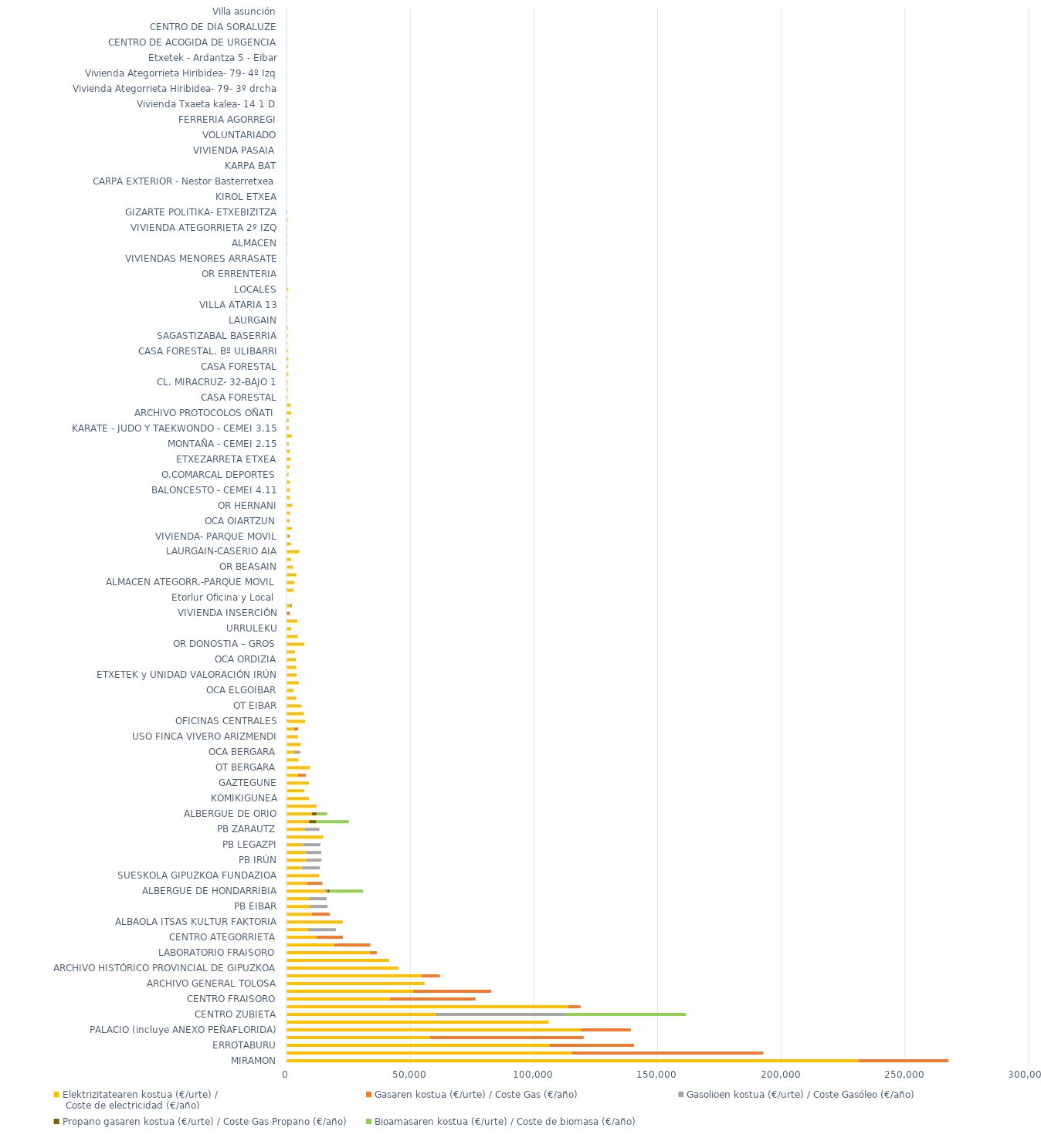
| Category | Elektrizitatearen kostua (€/urte) /
 Coste de electricidad (€/año) | Gasaren kostua (€/urte) / Coste Gas (€/año) | Gasolioen kostua (€/urte) / Coste Gasóleo (€/año) | Propano gasaren kostua (€/urte) / Coste Gas Propano (€/año) | Bioamasaren kostua (€/urte) / Coste de biomasa (€/año) |
|---|---|---|---|---|---|
| MIRAMON | 231364.7 | 36235.9 | 0 | 0 | 0 |
| EGOGAIN | 115340 | 77398.4 | 0 | 0 | 0 |
| ERROTABURU | 106259.96 | 34172 | 0 | 0 | 0 |
| TXARA I | 58013.21 | 62116.01 | 0 | 0 | 0 |
| PALACIO (incluye ANEXO PEÑAFLORIDA) | 118980.32 | 20215.16 | 0 | 0 | 0 |
| GORDAILUA | 105990.9 | 0 | 0 | 0 | 0 |
| CENTRO ZUBIETA | 60379.55 | 0 | 52467.32 | 0 | 48700 |
| KOLDO MITXELENA | 113999.61 | 4859.34 | 0 | 0 | 0 |
| CENTRO FRAISORO | 41751.06 | 34642.46 | 0 | 0 | 0 |
| CENTRO DONOSTIA | 51163.24 | 31591.68 | 0 | 0 | 0 |
| ARCHIVO GENERAL TOLOSA | 55838.9 | 0 | 0 | 0 | 0 |
| TXARA II | 54720.2 | 7291.5 | 0 | 0 | 0 |
| ARCHIVO HISTÓRICO PROVINCIAL DE GIPUZKOA | 45386.57 | 0 | 0 | 0 | 0 |
| JULIO CARO BAROJA | 41506.04 | 0 | 0 | 0 | 0 |
| LABORATORIO FRAISORO | 33655.47 | 2829.2 | 0 | 0 | 0 |
| ALBERGUE DE ZARAUTZ | 19255.6 | 14665.4 | 0 | 0 | 0 |
| CENTRO ATEGORRIETA | 12198.14 | 10589.79 | 0 | 0 | 0 |
| IMPRENTA | 8701.25 | 0 | 11229.2 | 0 | 0 |
| ALBAOLA ITSAS KULTUR FAKTORIA | 22791.38 | 0 | 0 | 0 | 0 |
| CENTRO DR. ZUBILLAGA | 10267.03 | 7154.07 | 0 | 0 | 0 |
| PB EIBAR | 9430.4 | 0 | 7178.6 | 0 | 0 |
| PB ORDIZIA | 8958.7 | 0 | 7278.3 | 0 | 0 |
| ALBERGUE DE HONDARRIBIA | 15646.3 | 0 | 879.2 | 894.7 | 13565.7 |
| PB AZPEITIA | 8334.77 | 6155.6 | 0 | 0 | 0 |
| SUESKOLA GIPUZKOA FUNDAZIOA | 13236.43 | 0 | 0 | 0 | 0 |
| PB OÑATI | 6125.6 | 0 | 7362.5 | 0 | 0 |
| PB IRÚN | 7975.4 | 0 | 6159.1 | 0 | 0 |
| PB TOLOSA | 7710.4 | 0 | 6332.4 | 0 | 0 |
| PB LEGAZPI | 6665.5 | 0 | 7012.6 | 0 | 0 |
| OT AZPEITIA | 14864.8 | 0 | 0 | 0 | 0 |
| PB ZARAUTZ | 7405.2 | 0 | 5870.8 | 0 | 0 |
| ALBERGUE DE SEGURA | 9123.7 | 0 | 0 | 2961.8 | 13128.5 |
| ALBERGUE DE ORIO | 10203.5 | 0 | 0 | 1940.6 | 4284 |
| OT IRUN | 12130 | 0 | 0 | 0 | 0 |
| KOMIKIGUNEA | 9166.98 | 0 | 0 | 0 | 0 |
| C. FORESTAL | 7220.62 | 0 | 0 | 0 | 0 |
| GAZTEGUNE | 9126.3 | 0 | 0 | 0 | 0 |
| JOSETXU ENEA | 4599.6 | 3229 | 0 | 0 | 0 |
| OT BERGARA | 9430 | 0 | 0 | 0 | 0 |
| ITURRARAN - Invernaderos | 4822.14 | 0 | 0 | 0 | 0 |
| OCA BERGARA | 3125.27 | 0 | 2395.21 | 0 | 0 |
| OT TOLOSA | 5831.6 | 0 | 0 | 0 | 0 |
| USO FINCA VIVERO ARIZMENDI | 4573.61 | 0 | 0 | 0 | 0 |
| OCA TOLOSA | 3024.29 | 1705.46 | 0 | 0 | 0 |
| OFICINAS CENTRALES | 7496.5 | 0 | 0 | 0 | 0 |
| Escuela de Cine TABAKALERA | 7023.81 | 0 | 0 | 0 | 0 |
| OT EIBAR | 6056.7 | 0 | 0 | 0 | 0 |
| OFICINA DE TURISMO | 3934.91 | 0 | 0 | 0 | 0 |
| OCA ELGOIBAR | 2872.68 | 0 | 0 | 0 | 0 |
| FINCA ZUBIETA | 4938.06 | 0 | 0 | 0 | 0 |
| ETXETEK y UNIDAD VALORACIÓN IRÚN | 4198.48 | 0 | 0 | 0 | 0 |
| GIZALDE | 3940.38 | 0 | 0 | 0 | 0 |
| OCA ORDIZIA | 3814.07 | 0 | 0 | 0 | 0 |
| FED.PIRAGUISMO | 3425.54 | 0 | 0 | 0 | 0 |
| OR DONOSTIA – GROS | 7227.7 | 0 | 0 | 0 | 0 |
| OR DONOSTIA  AMARA | 4398.3 | 0 | 0 | 0 | 0 |
| URRULEKU | 1935.9 | 0 | 0 | 0 | 0 |
| ORGANIZ. BIBLIOTECARIA | 4399.9 | 0 | 0 | 0 | 0 |
| VIVIENDA INSERCIÓN | 0 | 1412.99 | 0 | 0 | 0 |
| OCA ZARAUTZ | 1583.94 | 594.24 | 0 | 0 | 0 |
| Etorlur Oficina y Local  | 0 | 0 | 0 | 0 | 0 |
| FEDERACIONES - ZUATZU EDIF. BIDASOA | 2931.2 | 0 | 0 | 0 | 0 |
| ALMACEN ATEGORR.-PARQUE MOVIL | 3221.73 | 0 | 0 | 0 | 0 |
| ALMACEN - REKALDE ARCHIVO | 4024.23 | 0 | 0 | 0 | 0 |
| OR BEASAIN | 2623.6 | 0 | 0 | 0 | 0 |
| CAZA - CEMEI 3.17 | 1846.08 | 0 | 0 | 0 | 0 |
| LAURGAIN-CASERIO AIA | 5144.13 | 0 | 0 | 0 | 0 |
| UNIDAD VALORACIÓN | 1793.39 | 0 | 0 | 0 | 0 |
| VIVIENDA- PARQUE MOVIL | 540.26 | 662.46 | 0 | 0 | 0 |
| ETXETEK y UNIDAD VALORACIÓN - ANDOAIN | 2181.04 | 0 | 0 | 0 | 0 |
| OCA OIARTZUN | 716.94 | 380.06 | 0 | 0 | 0 |
| NATACIÓN - CEMEI 2.16 | 1518.08 | 0 | 0 | 0 | 0 |
| OR HERNANI | 2271.1 | 0 | 0 | 0 | 0 |
| DEPORTE ADAPTADO - CEMEI 2.17 | 1394.31 | 0 | 0 | 0 | 0 |
| BALONCESTO - CEMEI 4.11 | 1300.57 | 0 | 0 | 0 | 0 |
| PELOTA - CEMEI 3.06 | 1310.04 | 0 | 0 | 0 | 0 |
| O.COMARCAL DEPORTES | 856.9 | 0 | 0 | 0 | 0 |
| ATLETISMO - CEMEI 4.06 | 1163.19 | 0 | 0 | 0 | 0 |
| ETXEZARRETA ETXEA | 1727.07 | 0 | 0 | 0 | 0 |
| Bº BURRUGARRETA GARAJE | 1348.31 | 0 | 0 | 0 | 0 |
| MONTAÑA - CEMEI 2.15 | 969.63 | 0 | 0 | 0 | 0 |
| ETXETEK y UNIDAD VALORACIÓN - ZARAUTZ | 2100.66 | 0 | 0 | 0 | 0 |
| KARATE - JUDO Y TAEKWONDO - CEMEI 3.15 | 998.21 | 0 | 0 | 0 | 0 |
| REMO - CEMEI 2.04 | 912.74 | 0 | 0 | 0 | 0 |
| ARCHIVO PROTOCOLOS OÑATI | 1848.3 | 0 | 0 | 0 | 0 |
| ARIZMENDI – ERREKUPERAZIO GUNEA | 1642.24 | 0 | 0 | 0 | 0 |
| CASA FORESTAL | 456.21 | 0 | 0 | 0 | 0 |
| GIZARTE POLITIKA- ETXEBIZITZA | 523.01 | 0 | 0 | 0 | 0 |
| CL. MIRACRUZ- 32-BAJO 1 | 479.27 | 0 | 0 | 0 | 0 |
| ESCALERA - VIVIENDA  | 740.91 | 0 | 0 | 0 | 0 |
| CASA FORESTAL | 591.43 | 0 | 0 | 0 | 0 |
| BOXEO- AUTOMOVILISMO y OF. DIPUTACIÓN - CEMEI 3.04 | 738.12 | 0 | 0 | 0 | 0 |
| CASA FORESTAL. Bº ULIBARRI | 539.72 | 0 | 0 | 0 | 0 |
| SARROLA BASERRIA | 361.37 | 0 | 0 | 0 | 0 |
| SAGASTIZABAL BASERRIA | 506.62 | 0 | 0 | 0 | 0 |
| ALMACEN BELARTZA | 461.76 | 0 | 0 | 0 | 0 |
| LAURGAIN | 96.78 | 23.03 | 0 | 0 | 0 |
| CASERIO ORBELAUN | 293.58 | 0 | 0 | 0 | 0 |
| VILLA ATARIA 13 | 284.34 | 10.43 | 0 | 0 | 0 |
| NAVALALDEA- Pabellón A10 | 426.78 | 0 | 0 | 0 | 0 |
| LOCALES | 681.85 | 0 | 0 | 0 | 0 |
| ESTABLO | 325.65 | 0 | 0 | 0 | 0 |
| OR ERRENTERIA | 178.2 | 0 | 0 | 0 | 0 |
| SOTO MUELLE | 141.03 | 0 | 0 | 0 | 0 |
| VIVIENDAS MENORES ARRASATE | 48.99 | 0 | 0 | 0 | 0 |
| CASA FORESTAL OTZAURTE | 241.36 | 0 | 0 | 0 | 0 |
| ALMACEN | 366.99 | 0 | 0 | 0 | 0 |
| GIZARTE POLITIKA- ETXEBIZITZA | 146.15 | 187.78 | 0 | 0 | 0 |
| VIVIENDA ATEGORRIETA 2º IZQ | 226.58 | 76.85 | 0 | 0 | 0 |
| AMEZKETALARDI | 487.42 | 0 | 0 | 0 | 0 |
| GIZARTE POLITIKA- ETXEBIZITZA | 144.03 | 191.8 | 0 | 0 | 0 |
| VIVIENDA ATEGORRIETA 1º DRCH | 13.52 | 0 | 0 | 0 | 0 |
| KIROL ETXEA | 0 | 0 | 0 | 0 | 0 |
| Bº IBAETA-GARAJE (Archivo Pr.) | 0 | 0 | 0 | 0 | 0 |
| CARPA EXTERIOR - Nestor Basterretxea | 0 | 0 | 0 | 0 | 0 |
| CASA DEL MAR HOSPEDERÍA PASAIA | 0 | 0 | 0 | 0 | 0 |
| KARPA BAT | 0 | 0 | 0 | 0 | 0 |
| VIVIENDA ATEGORRIETA 4ºDRCH | 0 | 2.78 | 0 | 0 | 0 |
| VIVIENDA PASAIA  | 138.14 | 0 | 0 | 0 | 0 |
| CENTRO DE DIA PERSONAS ENFERMEDAD MENTAL | 0 | 0 | 0 | 0 | 0 |
| VOLUNTARIADO | 0 | 0 | 0 | 0 | 0 |
| PISO DE MUJERES | 0 | 0 | 0 | 0 | 0 |
| FERRERIA AGORREGI | 0 | 0 | 0 | 0 | 0 |
| Vivienda Txaeta kalea- 14 1 C | 0 | 0 | 0 | 0 | 0 |
| Vivienda Txaeta kalea- 14 1 D | 0 | 0 | 0 | 0 | 0 |
| ZIKUÑAGA ADINGABEEN ZENTROA | 0 | 0 | 0 | 0 | 0 |
| Vivienda Ategorrieta Hiribidea- 79- 3º drcha | 0 | 0 | 0 | 0 | 0 |
| Vivienda Ategorrieta Hiribidea- 79- 3º Izq | 0 | 0 | 0 | 0 | 0 |
| Vivienda Ategorrieta Hiribidea- 79- 4º Izq | 0 | 0 | 0 | 0 | 0 |
| Garaje Juntas Generales (Edificio antiguo) | 0 | 0 | 0 | 0 | 0 |
| Etxetek - Ardantza 5 - Eibar | 0 | 0 | 0 | 0 | 0 |
| Etxetek - Ardantza 9 - Eibar | 0 | 0 | 0 | 0 | 0 |
| CENTRO DE ACOGIDA DE URGENCIA | 0 | 0 | 0 | 0 | 0 |
| Centro Inserción Social  | 0 | 0 | 0 | 0 | 0 |
| CENTRO DE DIA SORALUZE | 0 | 0 | 0 | 0 | 0 |
| Almacen SACEM | 0 | 0 | 0 | 0 | 0 |
| Villa asunción | 0 | 0 | 0 | 0 | 0 |